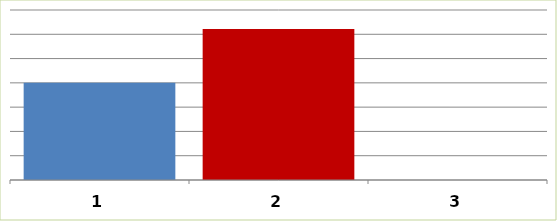
| Category | Series 0 |
|---|---|
| 0 | 2000277 |
| 1 | 3110000 |
| 2 | 0 |